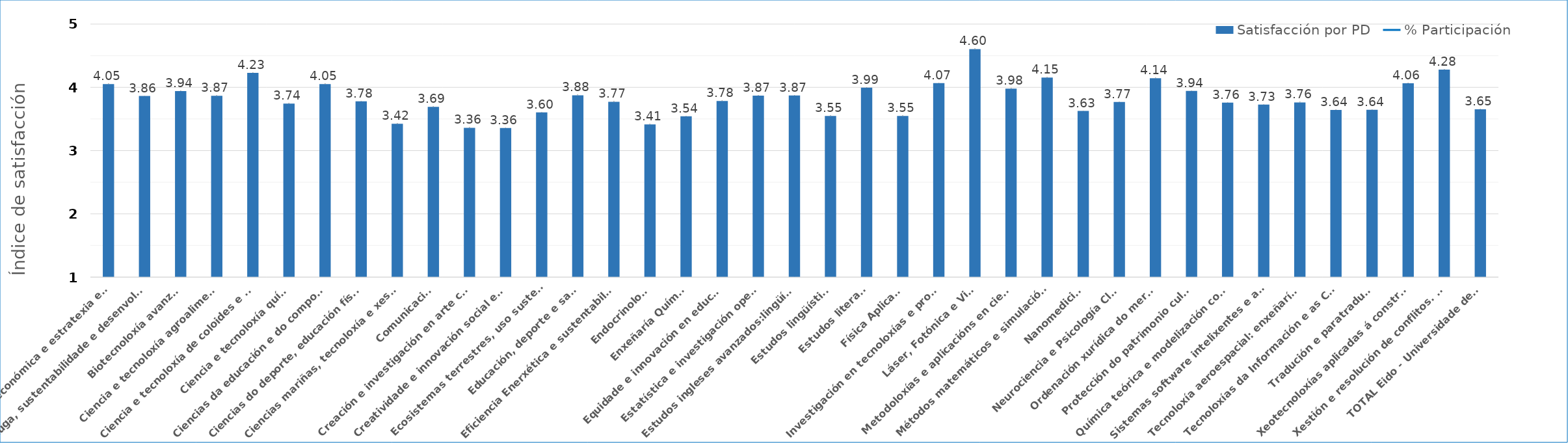
| Category | Satisfacción por PD |
|---|---|
| Análise económica e estratexia empresarial | 4.052 |
| Auga, sustentabilidade e desenvolvemento | 3.863 |
| Biotecnoloxía avanzada | 3.941 |
| Ciencia e tecnoloxía agroalimentaria | 3.866 |
| Ciencia e tecnoloxía de coloides e interfaces | 4.23 |
| Ciencia e tecnoloxía química | 3.743 |
| Ciencias da educación e do comportamiento | 4.05 |
| Ciencias do deporte, educación física e actividade física saudable | 3.779 |
| Ciencias mariñas, tecnoloxía e xestión (Campus do Mar) | 3.423 |
| Comunicación | 3.692 |
| Creación e investigación en arte contemporánea | 3.36 |
| Creatividade e innovación social e sustentable | 3.357 |
| Ecosistemas terrestres, uso sustentable e implicacións ambientais | 3.605 |
| Educación, deporte e saúde | 3.875 |
| Eficiencia Enerxética e sustentabilidade en enxeñaría e arquitectura | 3.772 |
| Endocrinoloxía | 3.413 |
| Enxeñaría Química | 3.543 |
| Equidade e innovación en educación | 3.785 |
| Estatística e investigación operativa | 3.869 |
| Estudos ingleses avanzados:lingüística, literatura e cultura | 3.871 |
| Estudos lingüísticos | 3.549 |
| Estudos literarios | 3.994 |
| Física Aplicada | 3.547 |
| Investigación en tecnoloxías e procesos avanzados na industria | 4.068 |
| Láser, Fotónica e Visión | 4.604 |
| Metodoloxías e aplicacións en ciencias da vida | 3.979 |
| Métodos matemáticos e simulación numérica en enxeñaría e ciencias aplicadas | 4.154 |
| Nanomedicina | 3.626 |
| Neurociencia e Psicología Clínica | 3.768 |
| Ordenación xurídica do mercado | 4.144 |
| Protección do patrimonio cultural | 3.944 |
| Química teórica e modelización computacional | 3.759 |
| Sistemas software intelixentes e adaptables | 3.729 |
| Tecnoloxía aeroespacial: enxeñarías electromagnética, electrónica, informática e mecánica | 3.762 |
| Tecnoloxías da Información e as Comunicacións | 3.642 |
| Tradución e paratradución | 3.645 |
| Xeotecnoloxías aplicadas á construción, enerxía e industria | 4.064 |
| Xestión e resolución de conflitos. Menores, Familia e Xusticia terapéutica | 4.281 |
| TOTAL Eido - Universidade de Vigo | 3.654 |